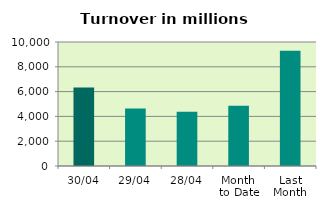
| Category | Series 0 |
|---|---|
| 30/04 | 6331.895 |
| 29/04 | 4639.637 |
| 28/04 | 4373.223 |
| Month 
to Date | 4850.364 |
| Last
Month | 9287.764 |